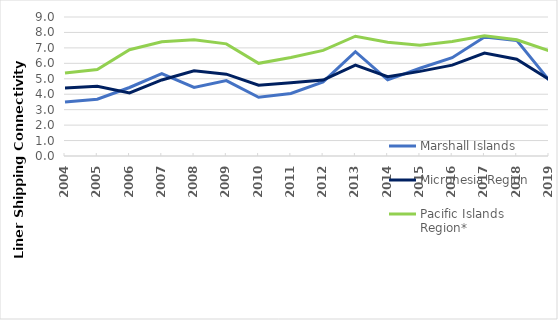
| Category | Marshall Islands | Micronesia Region | Pacific Islands Region* |
|---|---|---|---|
| 2004.0 | 3.49 | 4.404 | 5.369 |
| 2005.0 | 3.68 | 4.51 | 5.596 |
| 2006.0 | 4.435 | 4.087 | 6.884 |
| 2007.0 | 5.33 | 4.925 | 7.393 |
| 2008.0 | 4.435 | 5.513 | 7.525 |
| 2009.0 | 4.885 | 5.298 | 7.261 |
| 2010.0 | 3.805 | 4.581 | 6.002 |
| 2011.0 | 4.049 | 4.746 | 6.378 |
| 2012.0 | 4.796 | 4.915 | 6.839 |
| 2013.0 | 6.755 | 5.889 | 7.757 |
| 2014.0 | 4.929 | 5.135 | 7.36 |
| 2015.0 | 5.683 | 5.48 | 7.173 |
| 2016.0 | 6.368 | 5.885 | 7.417 |
| 2017.0 | 7.705 | 6.662 | 7.778 |
| 2018.0 | 7.485 | 6.265 | 7.527 |
| 2019.0 | 4.919 | 4.965 | 6.816 |